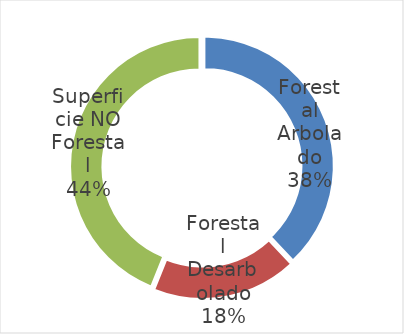
| Category | Series 0 |
|---|---|
|   Forestal Arbolado | 38.005 |
|   Forestal Desarbolado | 18.078 |
| Superficie NO Forestal | 43.917 |